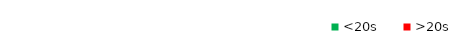
| Category | <20s | >20s |
|---|---|---|
| 0 | 0 | 0 |